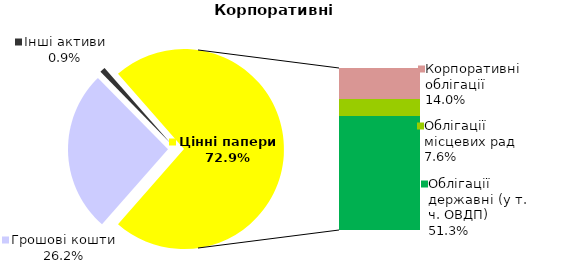
| Category | Корпоративні |
|---|---|
| Грошові кошти | 90.345 |
| Банківські метали | 0 |
| Нерухомість | 0 |
| Інші активи | 3.071 |
| Акції | 0.022 |
| Корпоративні облігації | 48.331 |
| Облігації місцевих рад | 26.355 |
| Облігації державні (у т. ч. ОВДП) | 177.123 |